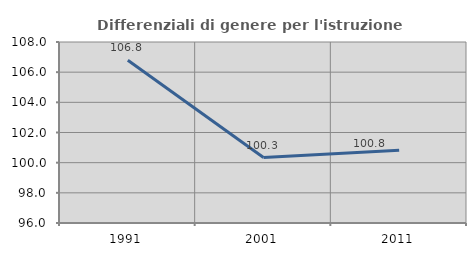
| Category | Differenziali di genere per l'istruzione superiore |
|---|---|
| 1991.0 | 106.795 |
| 2001.0 | 100.337 |
| 2011.0 | 100.815 |